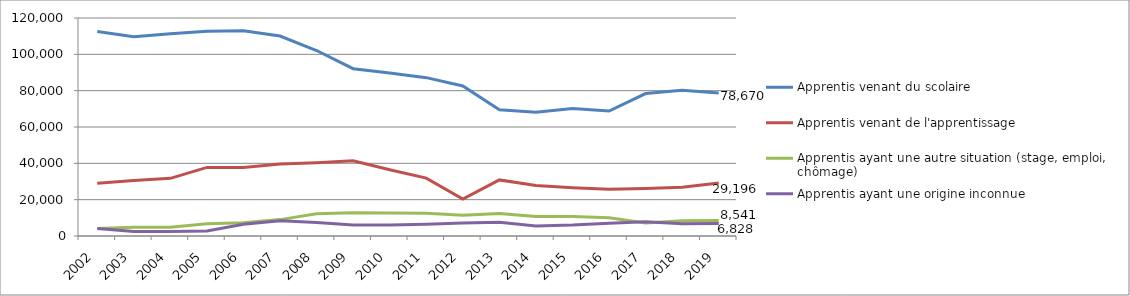
| Category | Apprentis venant du scolaire | Apprentis venant de l'apprentissage | Apprentis ayant une autre situation (stage, emploi, chômage) | Apprentis ayant une origine inconnue |
|---|---|---|---|---|
| 2002 | 112512 | 29069 | 4162 | 4152 |
| 2003 | 109730 | 30568 | 4855 | 2513 |
| 2004 | 111393 | 31736 | 4855 | 2513 |
| 2005 | 112721 | 37760 | 6776 | 2791 |
| 2006 | 113039 | 37692 | 7230 | 6519 |
| 2007 | 110092 | 39666 | 9018 | 8431 |
| 2008 | 102095 | 40368 | 12251 | 7432 |
| 2009 | 92103 | 41361 | 12752 | 6032 |
| 2010 | 89787 | 36505 | 12663 | 5993 |
| 2011 | 87159 | 31856 | 12529 | 6429 |
| 2012 | 82579 | 20362 | 11379 | 7114 |
| 2013 | 69439 | 30881 | 12384 | 7604 |
| 2014 | 68086 | 27764 | 10754 | 5569 |
| 2015 | 70128 | 26531 | 10748 | 5991 |
| 2016 | 68773 | 25711 | 10088 | 7063 |
| 2017 | 78408 | 26126 | 7221 | 7865 |
| 2018 | 80284 | 26881 | 8369 | 6798 |
| 2019 | 78670 | 29196 | 8541 | 6828 |